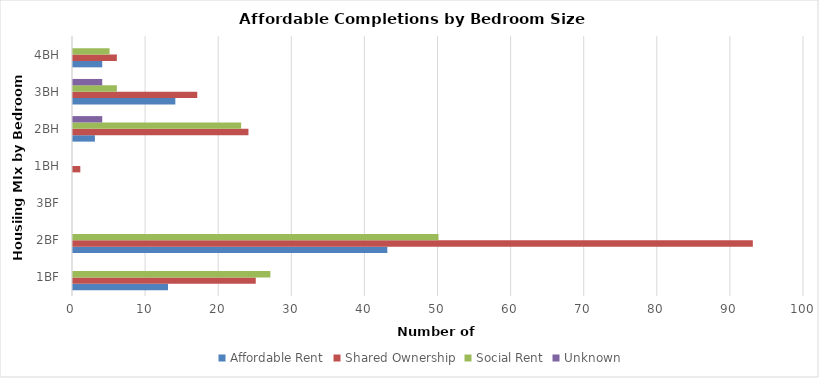
| Category | Affordable Rent | Shared Ownership | Social Rent | Unknown |
|---|---|---|---|---|
| 1BF | 13 | 25 | 27 | 0 |
| 2BF | 43 | 93 | 50 | 0 |
| 3BF | 0 | 0 | 0 | 0 |
| 1BH | 0 | 1 | 0 | 0 |
| 2BH | 3 | 24 | 23 | 4 |
| 3BH | 14 | 17 | 6 | 4 |
| 4BH | 4 | 6 | 5 | 0 |